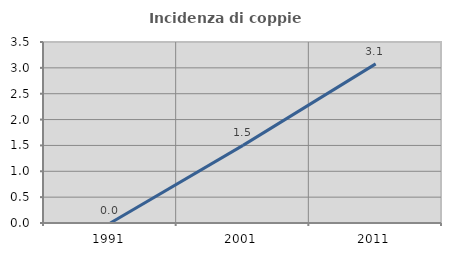
| Category | Incidenza di coppie miste |
|---|---|
| 1991.0 | 0 |
| 2001.0 | 1.502 |
| 2011.0 | 3.077 |